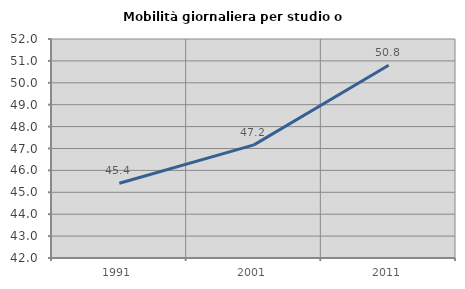
| Category | Mobilità giornaliera per studio o lavoro |
|---|---|
| 1991.0 | 45.415 |
| 2001.0 | 47.164 |
| 2011.0 | 50.802 |